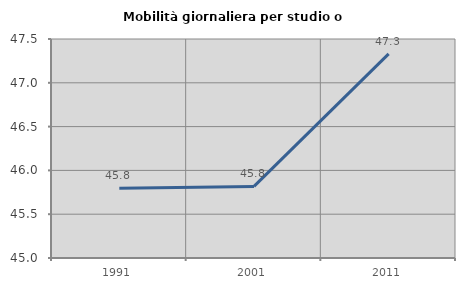
| Category | Mobilità giornaliera per studio o lavoro |
|---|---|
| 1991.0 | 45.795 |
| 2001.0 | 45.817 |
| 2011.0 | 47.33 |